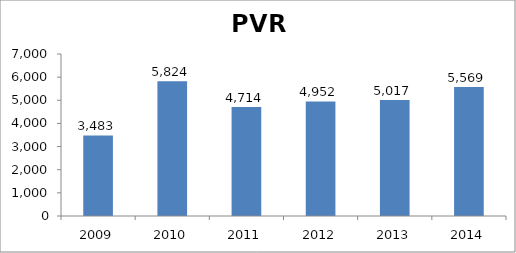
| Category | PVR |
|---|---|
| 2009.0 | 3483 |
| 2010.0 | 5824 |
| 2011.0 | 4714 |
| 2012.0 | 4952 |
| 2013.0 | 5017 |
| 2014.0 | 5569 |